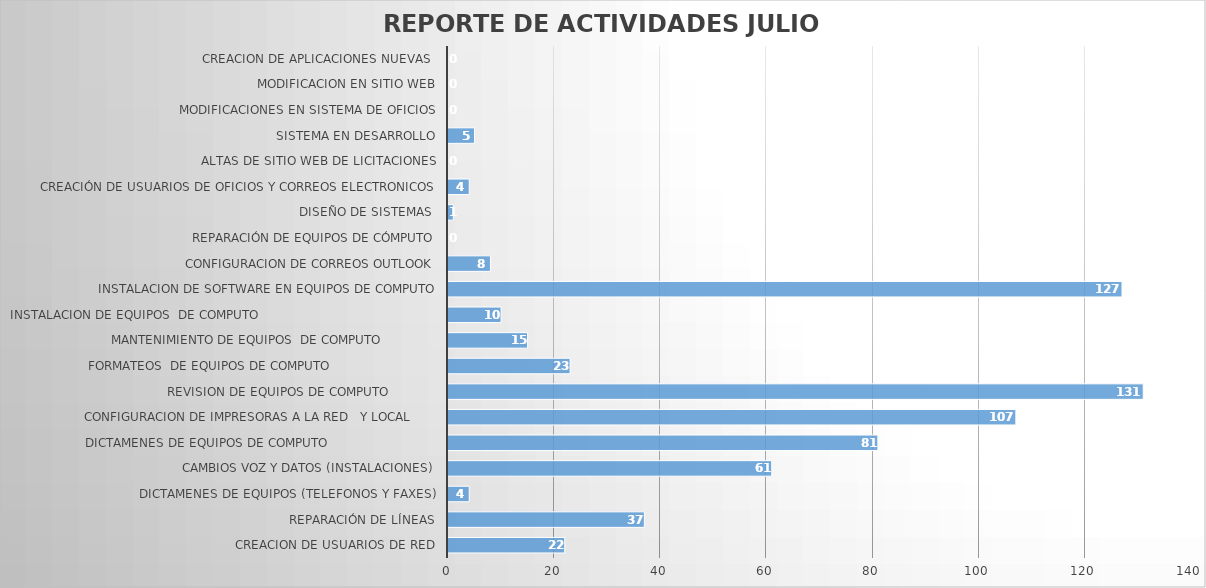
| Category | jul-22 |
|---|---|
| CREACION DE USUARIOS DE RED | 22 |
| REPARACIÓN DE LÍNEAS | 37 |
| DICTAMENES DE EQUIPOS (TELEFONOS Y FAXES) | 4 |
| CAMBIOS VOZ Y DATOS (INSTALACIONES) | 61 |
| DICTAMENES DE EQUIPOS DE COMPUTO                             | 81 |
| CONFIGURACION DE IMPRESORAS A LA RED   Y LOCAL       | 107 |
| REVISION DE EQUIPOS DE COMPUTO             | 131 |
| FORMATEOS  DE EQUIPOS DE COMPUTO                            | 23 |
| MANTENIMIENTO DE EQUIPOS  DE COMPUTO               | 15 |
| INSTALACION DE EQUIPOS  DE COMPUTO                                               | 10 |
| INSTALACION DE SOFTWARE EN EQUIPOS DE COMPUTO | 127 |
| CONFIGURACION DE CORREOS OUTLOOK | 8 |
| REPARACIÓN DE EQUIPOS DE CÓMPUTO | 0 |
| DISEÑO DE SISTEMAS  | 1 |
| CREACIÓN DE USUARIOS DE OFICIOS Y CORREOS ELECTRONICOS | 4 |
| ALTAS DE SITIO WEB DE LICITACIONES | 0 |
| SISTEMA EN DESARROLLO | 5 |
| MODIFICACIONES EN SISTEMA DE OFICIOS | 0 |
| MODIFICACION EN SITIO WEB | 0 |
| CREACION DE APLICACIONES NUEVAS  | 0 |